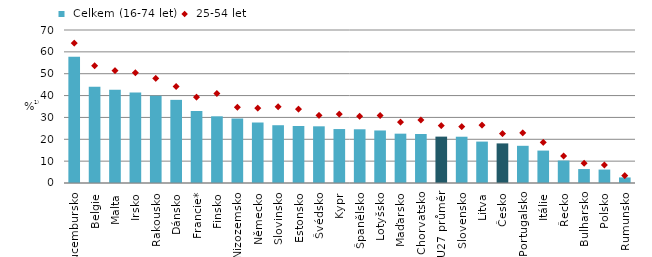
| Category |  Celkem (16-74 let) |
|---|---|
| Lucembursko | 57.75 |
| Belgie | 43.989 |
| Malta | 42.682 |
| Irsko | 41.357 |
| Rakousko | 39.961 |
| Dánsko | 38.041 |
| Francie* | 32.94 |
| Finsko | 30.512 |
| Nizozemsko | 29.453 |
| Německo | 27.675 |
| Slovinsko | 26.435 |
| Estonsko | 26.081 |
| Švédsko | 25.935 |
| Kypr | 24.683 |
| Španělsko | 24.578 |
| Lotyšsko | 24.031 |
| Maďarsko | 22.572 |
| Chorvatsko | 22.427 |
| EU27 průměr | 21.22 |
| Slovensko | 21.172 |
| Litva | 18.947 |
| Česko | 18.116 |
| Portugalsko | 17.019 |
| Itálie | 14.832 |
| Řecko | 10.268 |
| Bulharsko | 6.38 |
| Polsko | 6.145 |
| Rumunsko | 2.546 |